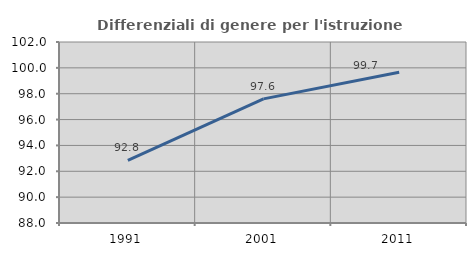
| Category | Differenziali di genere per l'istruzione superiore |
|---|---|
| 1991.0 | 92.836 |
| 2001.0 | 97.603 |
| 2011.0 | 99.666 |